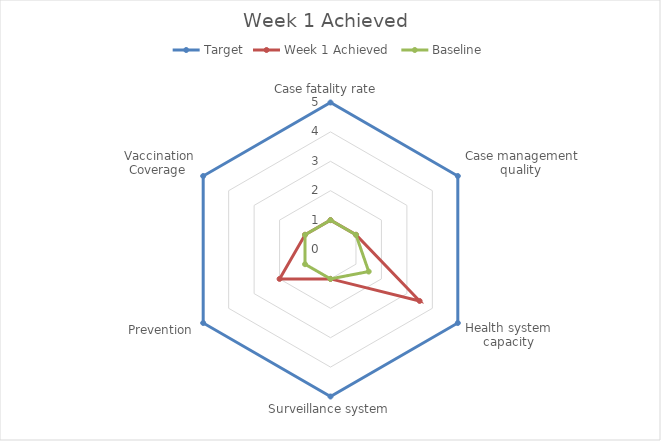
| Category | Target | Week 1 Achieved  | Baseline |
|---|---|---|---|
| Case fatality rate  | 5 | 1 | 1 |
| Case management quality  | 5 | 1 | 1 |
| Health system capacity | 5 | 3.5 | 1.5 |
| Surveillance system | 5 | 1 | 1 |
| Prevention | 5 | 2 | 1 |
| Vaccination Coverage  | 5 | 1 | 1 |